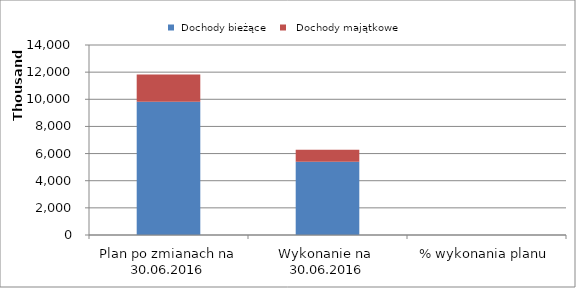
| Category |  Dochody bieżące |   Dochody majątkowe |
|---|---|---|
| Plan po zmianach na 30.06.2016 | 9817810.96 | 2015317 |
| Wykonanie na  30.06.2016 | 5397242.81 | 881738.14 |
| % wykonania planu | 0.55 | 0.438 |